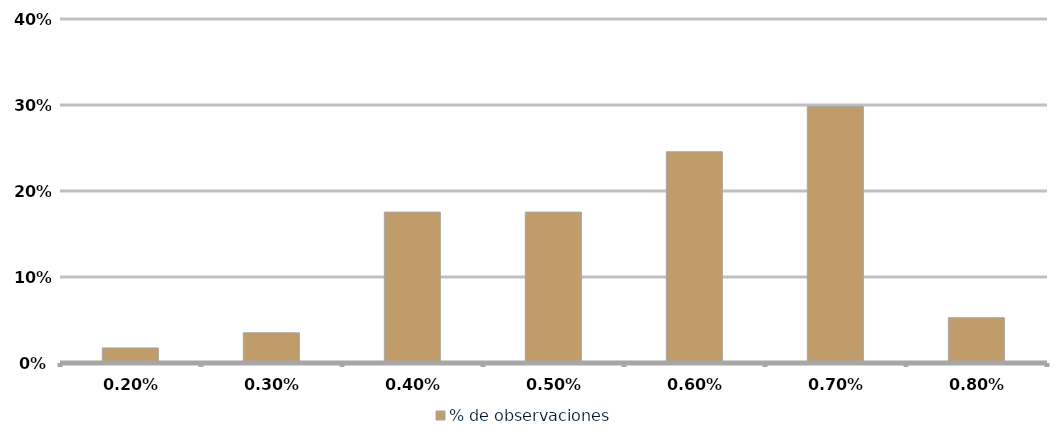
| Category | % de observaciones  |
|---|---|
| 0.002 | 0.018 |
| 0.003 | 0.035 |
| 0.004 | 0.175 |
| 0.005 | 0.175 |
| 0.006 | 0.246 |
| 0.007 | 0.298 |
| 0.008 | 0.053 |